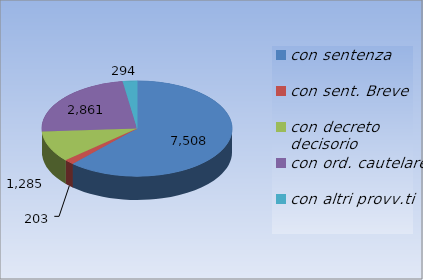
| Category | Ricorsi definiti |
|---|---|
| con sentenza | 7508 |
| con sent. Breve | 203 |
| con decreto decisorio | 1285 |
| con ord. cautelare | 2861 |
| con altri provv.ti | 294 |